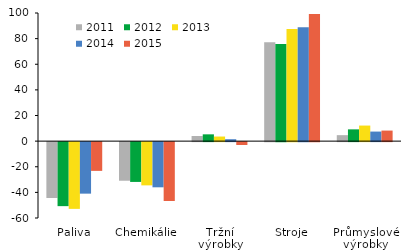
| Category | 2011 | 2012 | 2013 | 2014 | 2015 |
|---|---|---|---|---|---|
| Paliva | -43.599 | -49.965 | -52.094 | -40.215 | -22.439 |
| Chemikálie | -30.127 | -31.066 | -33.75 | -35.263 | -45.937 |
| Tržní výrobky | 3.994 | 5.295 | 3.578 | 1.486 | -2.241 |
| Stroje | 77.214 | 75.75 | 87.433 | 88.846 | 99.272 |
| Průmyslové výrobky | 4.657 | 9.183 | 12.146 | 7.455 | 8.235 |